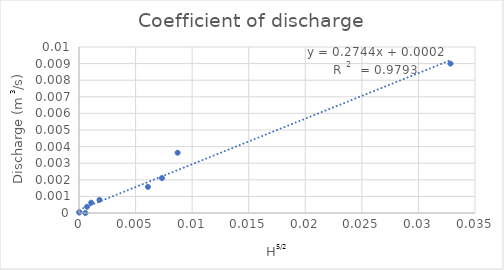
| Category | QA (m3/s) |
|---|---|
| 3.2381723240124196e-05 | 0 |
| 3.2381723240124196e-05 | 0 |
| 0.0018101933598375609 | 0.001 |
| 0.001077167872246475 | 0.001 |
| 0.0007094253836732936 | 0 |
| 0.007333648478076928 | 0.002 |
| 0.0060933816555341445 | 0.002 |
| 0.03283601543084971 | 0.009 |
| 0.0005590169943749478 | 0 |
| 0.008714212528966689 | 0.004 |